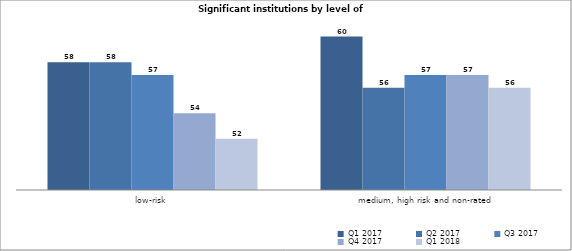
| Category | Q1 2017 | Q2 2017 | Q3 2017 | Q4 2017 | Q1 2018 |
|---|---|---|---|---|---|
| low-risk | 58 | 58 | 57 | 54 | 52 |
| medium, high risk and non-rated | 60 | 56 | 57 | 57 | 56 |